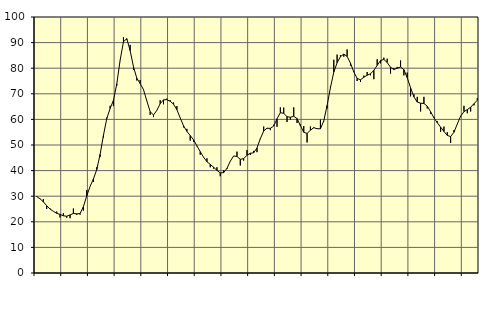
| Category | Piggar | Series 1 |
|---|---|---|
| nan | 30 | 29.84 |
| 87.0 | 28.9 | 29.01 |
| 87.0 | 28.9 | 27.8 |
| 87.0 | 25 | 26.3 |
| nan | 25.2 | 24.99 |
| 88.0 | 24.1 | 24.09 |
| 88.0 | 24 | 23.32 |
| 88.0 | 21.7 | 22.88 |
| nan | 23.4 | 22.35 |
| 89.0 | 21.6 | 22.17 |
| 89.0 | 21.4 | 22.69 |
| 89.0 | 25.2 | 23.29 |
| nan | 22.7 | 23.09 |
| 90.0 | 22.8 | 23.25 |
| 90.0 | 24.4 | 25.9 |
| 90.0 | 32.4 | 30.11 |
| nan | 33.8 | 33.82 |
| 91.0 | 35.6 | 36.71 |
| 91.0 | 41.3 | 40.41 |
| 91.0 | 45.4 | 46.29 |
| nan | 52.9 | 53.74 |
| 92.0 | 60.7 | 60.31 |
| 92.0 | 65.3 | 64.28 |
| 92.0 | 65.2 | 67.43 |
| nan | 73.2 | 73.88 |
| 93.0 | 83.2 | 83.12 |
| 93.0 | 92.1 | 90.35 |
| 93.0 | 91.2 | 91.53 |
| nan | 89.1 | 86.88 |
| 94.0 | 79.4 | 80.57 |
| 94.0 | 75.2 | 76.08 |
| 94.0 | 75.4 | 73.99 |
| nan | 71.5 | 71.62 |
| 95.0 | 67.3 | 67.22 |
| 95.0 | 61.8 | 62.99 |
| 95.0 | 60.9 | 61.74 |
| nan | 63.6 | 63.52 |
| 96.0 | 67.5 | 66.15 |
| 96.0 | 65.9 | 67.64 |
| 96.0 | 68.1 | 67.71 |
| nan | 67.5 | 67.07 |
| 97.0 | 66.6 | 65.94 |
| 97.0 | 65.2 | 63.81 |
| 97.0 | 60.6 | 60.58 |
| nan | 56.9 | 57.49 |
| 98.0 | 56.3 | 55.32 |
| 98.0 | 51.7 | 53.69 |
| 98.0 | 51.2 | 52 |
| nan | 49.5 | 49.69 |
| 99.0 | 46.2 | 47.39 |
| 99.0 | 45.3 | 45.21 |
| 99.0 | 44.8 | 43.49 |
| nan | 41.3 | 42.4 |
| 0.0 | 40.8 | 41.31 |
| 0.0 | 41.3 | 40.1 |
| 0.0 | 37.8 | 39.11 |
| nan | 40.1 | 39.2 |
| 1.0 | 40.6 | 40.89 |
| 1.0 | 43.6 | 43.66 |
| 1.0 | 45.7 | 45.72 |
| nan | 47.4 | 45.52 |
| 2.0 | 42 | 44.42 |
| 2.0 | 43.9 | 44.65 |
| 2.0 | 48 | 45.99 |
| nan | 46.1 | 46.77 |
| 3.0 | 47.7 | 46.96 |
| 3.0 | 47.2 | 48.87 |
| 3.0 | 52.3 | 52.47 |
| nan | 57.2 | 55.46 |
| 4.0 | 56.4 | 56.57 |
| 4.0 | 55.8 | 56.49 |
| 4.0 | 57.9 | 57.4 |
| nan | 57.1 | 60.26 |
| 5.0 | 64.7 | 62.62 |
| 5.0 | 64.6 | 62.36 |
| 5.0 | 59 | 61.07 |
| nan | 59.9 | 60.83 |
| 6.0 | 64.7 | 61.23 |
| 6.0 | 58.6 | 60.33 |
| 6.0 | 58 | 57.54 |
| nan | 57.4 | 54.97 |
| 7.0 | 51 | 54.52 |
| 7.0 | 57.2 | 55.76 |
| 7.0 | 56.6 | 56.78 |
| nan | 56.5 | 56.36 |
| 8.0 | 59.9 | 56.33 |
| 8.0 | 59.2 | 59.41 |
| 8.0 | 64.3 | 65.45 |
| nan | 72.8 | 72.41 |
| 9.0 | 83.3 | 78.47 |
| 9.0 | 85.3 | 82.15 |
| 9.0 | 85.1 | 84.51 |
| nan | 84.5 | 85.51 |
| 10.0 | 87.3 | 84.6 |
| 10.0 | 81 | 81.98 |
| 10.0 | 78.8 | 78.52 |
| nan | 75 | 76.01 |
| 11.0 | 74.6 | 75.48 |
| 11.0 | 77.1 | 76.45 |
| 11.0 | 78.5 | 77.27 |
| nan | 77.2 | 77.82 |
| 12.0 | 75.7 | 79.16 |
| 12.0 | 83.5 | 81.11 |
| 12.0 | 81.9 | 82.97 |
| nan | 84.1 | 83.42 |
| 13.0 | 83.7 | 82.24 |
| 13.0 | 77.9 | 80.32 |
| 13.0 | 80 | 79.5 |
| nan | 80.5 | 79.99 |
| 14.0 | 83 | 80.46 |
| 14.0 | 77.2 | 79.43 |
| 14.0 | 78.3 | 76.29 |
| nan | 69 | 72.36 |
| 15.0 | 69.8 | 68.81 |
| 15.0 | 68.8 | 66.77 |
| 15.0 | 63.1 | 66.33 |
| nan | 68.8 | 66.22 |
| 16.0 | 64.3 | 65.18 |
| 16.0 | 62.2 | 63 |
| 16.0 | 61 | 60.63 |
| nan | 59.3 | 58.71 |
| 17.0 | 55.2 | 56.99 |
| 17.0 | 57.2 | 55.28 |
| 17.0 | 55 | 53.74 |
| nan | 50.8 | 53.3 |
| 18.0 | 55.8 | 54.98 |
| 18.0 | 58.2 | 58.21 |
| 18.0 | 61 | 61.29 |
| nan | 65.3 | 63.03 |
| 19.0 | 62.4 | 63.84 |
| 19.0 | 63.1 | 64.74 |
| 19.0 | 65.5 | 66.16 |
| nan | 68.3 | 67.46 |